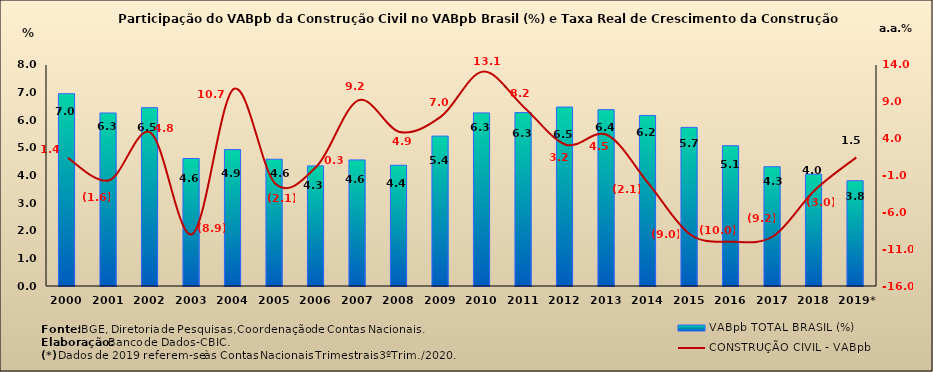
| Category | VABpb TOTAL BRASIL (%) |
|---|---|
| 2000 | 6.96 |
| 2001 | 6.264 |
| 2002 | 6.454 |
| 2003 | 4.615 |
| 2004 | 4.937 |
| 2005 | 4.589 |
| 2006 | 4.348 |
| 2007 | 4.564 |
| 2008 | 4.371 |
| 2009 | 5.426 |
| 2010 | 6.265 |
| 2011 | 6.277 |
| 2012 | 6.478 |
| 2013 | 6.382 |
| 2014 | 6.173 |
| 2015 | 5.742 |
| 2016 | 5.077 |
| 2017 | 4.316 |
| 2018 | 4.047 |
| 2019* | 3.809 |